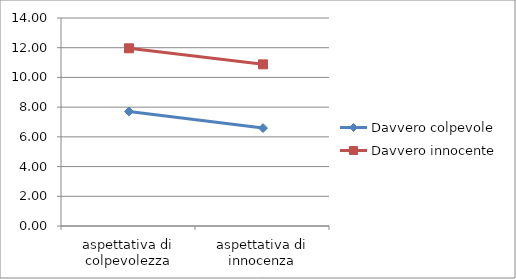
| Category | Davvero colpevole | Davvero innocente |
|---|---|---|
| aspettativa di colpevolezza | 7.71 | 11.96 |
| aspettativa di innocenza | 6.59 | 10.88 |